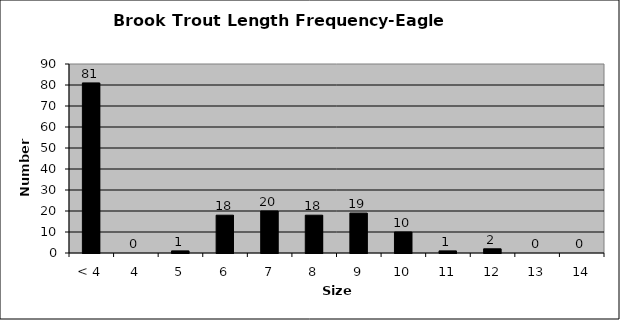
| Category | Series 0 |
|---|---|
| < 4 | 81 |
| 4 | 0 |
| 5 | 1 |
| 6 | 18 |
| 7 | 20 |
| 8 | 18 |
| 9 | 19 |
| 10 | 10 |
| 11 | 1 |
| 12 | 2 |
| 13 | 0 |
| 14 | 0 |